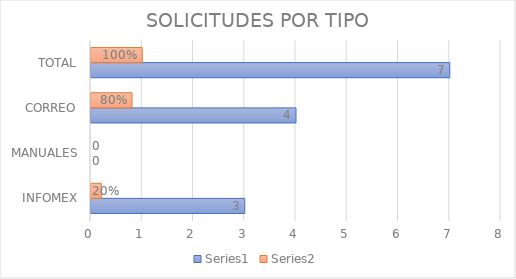
| Category | Series 0 | Series 1 |
|---|---|---|
| INFOMEX | 3 | 0.2 |
| MANUALES | 0 | 0 |
| CORREO | 4 | 0.8 |
| TOTAL | 7 | 1 |